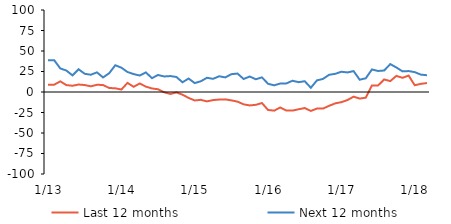
| Category | Last 12 months | Next 12 months |
|---|---|---|
|  1/13 | 8.92 | 38.82 |
|  2/13 | 8.92 | 38.82 |
|  3/13 | 12.98 | 28.75 |
|  4/13 | 8.4 | 26.12 |
|  5/13 | 7.64 | 20.26 |
|  6/13 | 9.1 | 27.71 |
|  7/13 | 8.51 | 22.2 |
|  8/13 | 6.89 | 21.06 |
|  9/13 | 8.81 | 23.95 |
|  10/13 | 8.54 | 17.76 |
|  11/13 | 4.88 | 22.87 |
|  12/13 | 4.53 | 32.62 |
|  1/14 | 2.99 | 29.64 |
|  2/14 | 11.1 | 24.37 |
|  3/14 | 6.35 | 21.86 |
|  4/14 | 10.34 | 20.09 |
|  5/14 | 6.57 | 23.91 |
|  6/14 | 4.33 | 16.91 |
|  7/14 | 3.35 | 20.75 |
|  8/14 | -0.33 | 18.95 |
|  9/14 | -2.37 | 19.44 |
|  10/14 | -0.5 | 18.32 |
|  11/14 | -3.3 | 11.85 |
|  12/14 | -7.21 | 16.46 |
|  1/15 | -10.32 | 10.88 |
|  2/15 | -9.55 | 13.1 |
|  3/15 | -11.45 | 17.32 |
|  4/15 | -9.85 | 16.04 |
|  5/15 | -9.22 | 19.19 |
|  6/15 | -8.99 | 17.77 |
|  7/15 | -10.2 | 21.74 |
|  8/15 | -11.76 | 22.49 |
|  9/15 | -15.03 | 15.86 |
|  10/15 | -16.38 | 18.89 |
|  11/15 | -15.64 | 15.55 |
|  12/15 | -13.49 | 17.84 |
|  1/16 | -21.91 | 10.03 |
|  2/16 | -22.72 | 8.16 |
|  3/16 | -18.91 | 10.34 |
|  4/16 | -22.65 | 10.48 |
|  5/16 | -22.69 | 13.73 |
|  6/16 | -21.05 | 11.99 |
|  7/16 | -19.56 | 13.15 |
|  8/16 | -23.1 | 5.15 |
|  9/16 | -20.21 | 14.17 |
|  10/16 | -20.19 | 16 |
|  11/16 | -16.81 | 20.99 |
|  12/16 | -13.84 | 22.19 |
|  1/17 | -12.4 | 24.7 |
|  2/17 | -9.79 | 23.87 |
|  3/17 | -5.67 | 25.48 |
|  4/17 | -8.04 | 14.94 |
|  5/17 | -6.9 | 16.78 |
|  6/17 | 7.95 | 27.5 |
|  7/17 | 7.9 | 25.66 |
|  8/17 | 15.28 | 26.2 |
|  9/17 | 13.3 | 34.02 |
|  10/17 | 19.64 | 29.89 |
|  11/17 | 17.29 | 25.16 |
|  12/18 | 20.01 | 25.53 |
|  1/18 | 8.26 | 24.23 |
|  2/18 | 9.94 | 21.21 |
|  3/18 | 10.91 | 20.44 |